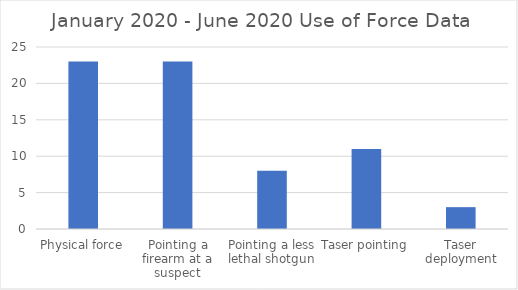
| Category | Series 0 |
|---|---|
| Physical force | 23 |
| Pointing a firearm at a suspect | 23 |
| Pointing a less lethal shotgun | 8 |
| Taser pointing | 11 |
| Taser deployment | 3 |